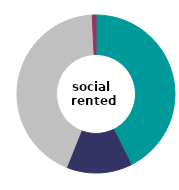
| Category | social 
rented |
|---|---|
| direct debit | 42.645 |
| standing order | 13.422 |
| pre-paid meter | 43.16 |
| other | 0.772 |